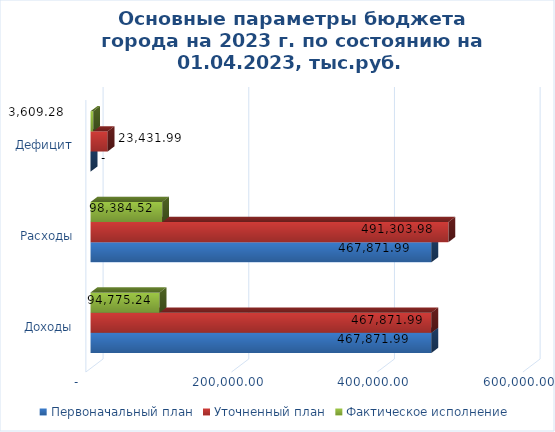
| Category | Первоначальный план | Уточненный план | Фактическое исполнение |
|---|---|---|---|
| Доходы | 467871.99 | 467871.99 | 94775.24 |
| Расходы | 467871.99 | 491303.98 | 98384.52 |
| Дефицит | 0 | 23431.99 | 3609.28 |